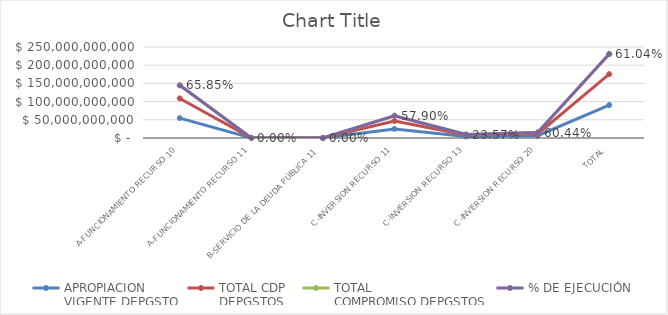
| Category | APROPIACION
VIGENTE DEPGSTO | TOTAL CDP
DEPGSTOS | TOTAL
COMPROMISO DEPGSTOS | % DE EJECUCIÓN |
|---|---|---|---|---|
| A-FUNCIONAMIENTO RECURSO 10 | 54721000000 | 53944108620.7 | 36032029112.49 | 0.658 |
| A-FUNCIONAMIENTO RECURSO 11 | 231000000 | 0 | 0 | 0 |
| B-SERVICIO DE LA DEUDA PÚBLICA 11 | 131748779 | 0 | 0 | 0 |
| C-INVERSION RECURSO 11 | 24983074635 | 21686676969 | 14464794034.95 | 0.579 |
| C-INVERSION RECURSO 13 | 4242000000 | 4242000000 | 1000000000 | 0.236 |
| C-INVERSION RECURSO 20 | 6251000000 | 5002322510 | 3778263495 | 0.604 |
| TOTAL | 90559823414 | 84875108099.7 | 55275086642.44 | 0.61 |